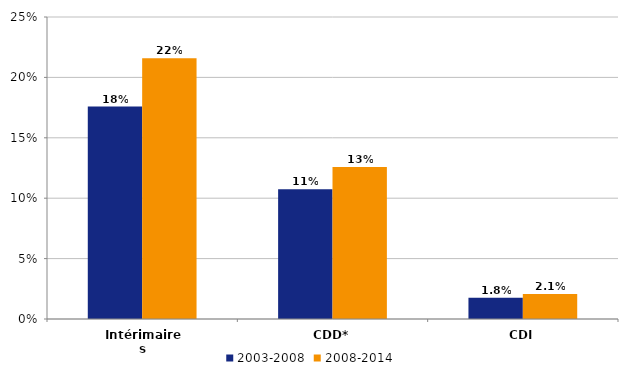
| Category | 2003-2008 | 2008-2014 |
|---|---|---|
| Intérimaires | 0.176 | 0.216 |
| CDD* | 0.107 | 0.126 |
| CDI | 0.018 | 0.021 |